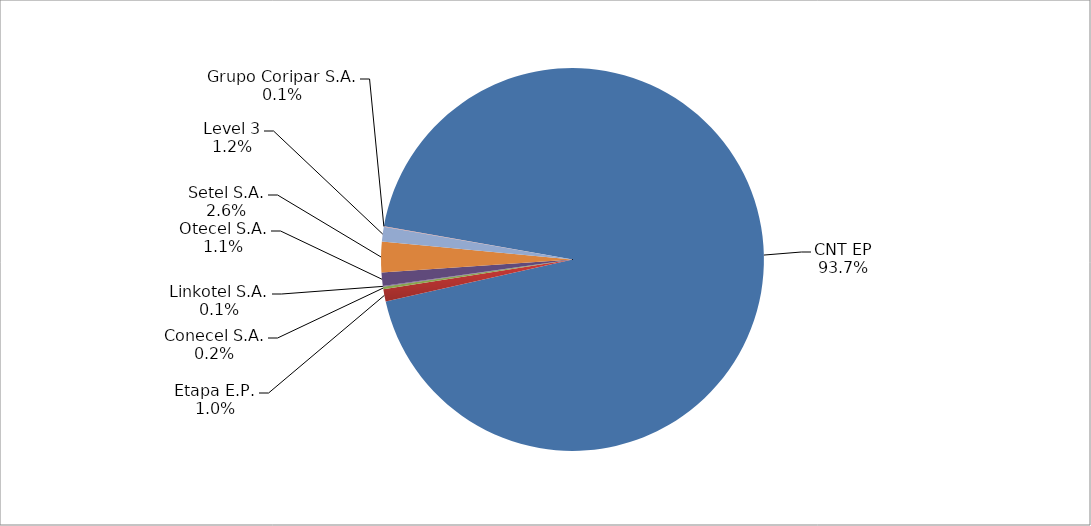
| Category | Series 0 |
|---|---|
| CNT EP | 2352 |
| Etapa E.P. | 26 |
| Conecel S.A. | 5 |
| Linkotel S.A. | 2 |
| Otecel S.A. | 28 |
| Setel S.A. | 65 |
| Level 3 | 31 |
| Grupo Coripar S.A. | 1 |